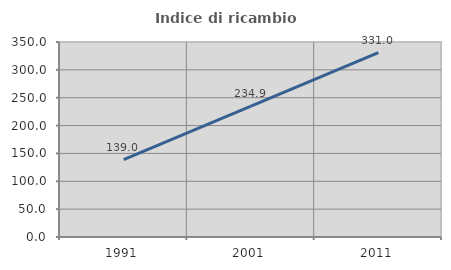
| Category | Indice di ricambio occupazionale  |
|---|---|
| 1991.0 | 139 |
| 2001.0 | 234.921 |
| 2011.0 | 331.034 |